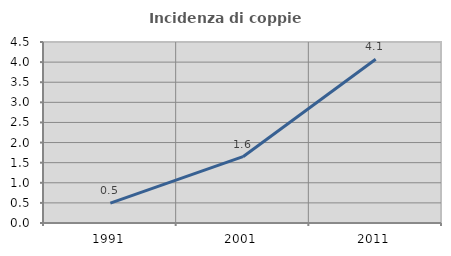
| Category | Incidenza di coppie miste |
|---|---|
| 1991.0 | 0.493 |
| 2001.0 | 1.648 |
| 2011.0 | 4.069 |